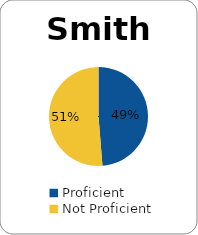
| Category | Series 0 |
|---|---|
| Proficient | 0.487 |
| Not Proficient | 0.513 |